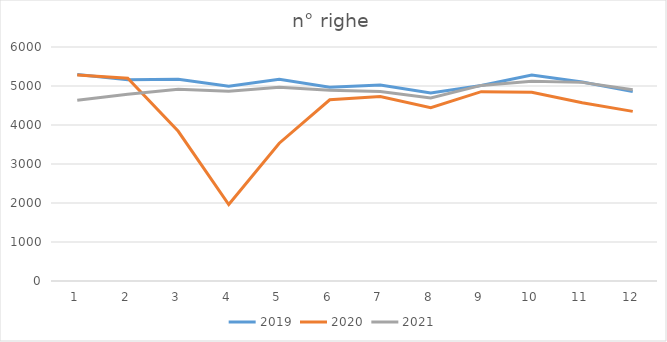
| Category | 2019 | 2020 | 2021 |
|---|---|---|---|
| 0 | 5296 | 5283 | 4633 |
| 1 | 5161 | 5199 | 4790 |
| 2 | 5172 | 3839 | 4918 |
| 3 | 4992 | 1962 | 4868 |
| 4 | 5174 | 3533 | 4965 |
| 5 | 4970 | 4647 | 4888 |
| 6 | 5024 | 4730 | 4859 |
| 7 | 4821 | 4444 | 4693 |
| 8 | 5015 | 4855 | 5015 |
| 9 | 5283 | 4838 | 5120 |
| 10 | 5102 | 4573 | 5093 |
| 11 | 4856 | 4349 | 4903 |